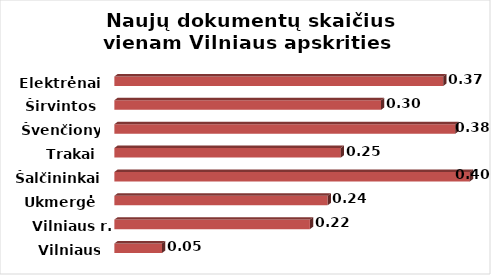
| Category | Series 0 |
|---|---|
| Vilniaus m. | 0.054 |
| Vilniaus r. | 0.22 |
| Ukmergė | 0.24 |
| Šalčininkai | 0.4 |
| Trakai | 0.255 |
| Švenčionys | 0.384 |
| Širvintos | 0.3 |
| Elektrėnai | 0.37 |